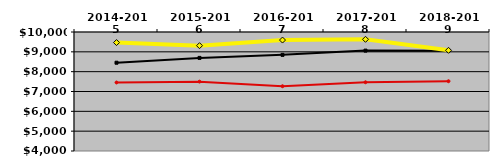
| Category | NATIONAL MEDIAN | WEST MEDIAN | TEXAS LUTHERAN |
|---|---|---|---|
| 2014-2015 | 8450.558 | 7454.534 | 9467.017 |
| 2015-2016 | 8693.909 | 7497.462 | 9310.984 |
| 2016-2017 | 8846.742 | 7266.428 | 9594.193 |
| 2017-2018 | 9061.41 | 7466.982 | 9631.144 |
| 2018-2019 | 9059.978 | 7518.898 | 9075.626 |